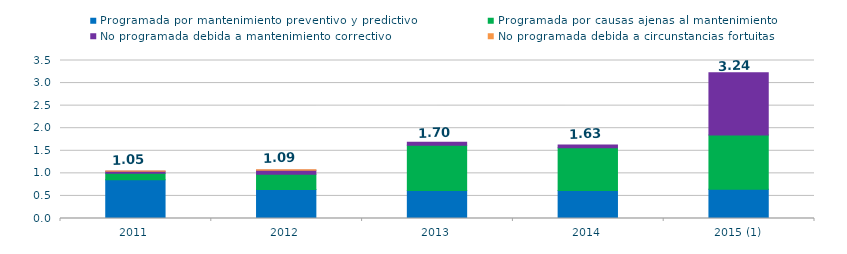
| Category | Programada por mantenimiento preventivo y predictivo | Programada por causas ajenas al mantenimiento  | No programada debida a mantenimiento correctivo  | No programada debida a circunstancias fortuitas  |
|---|---|---|---|---|
| 2011 | 0.859 | 0.143 | 0.047 | 0.002 |
| 2012 | 0.64 | 0.34 | 0.09 | 0.01 |
| 2013 | 0.62 | 1 | 0.07 | 0 |
| 2014 | 0.62 | 0.95 | 0.06 | 0 |
| 2015 (1) | 0.65 | 1.2 | 1.38 | 0 |